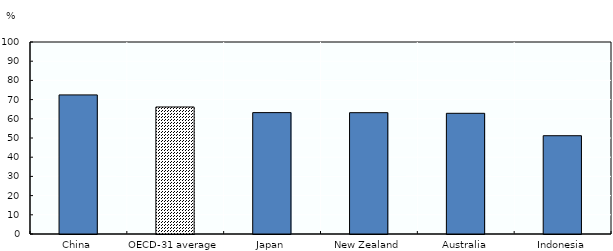
| Category | Series 1 |
|---|---|
| China | 72.44 |
| OECD-31 average | 66.162 |
| Japan | 63.22 |
| New Zealand | 63.191 |
| Australia | 62.864 |
| Indonesia | 51.19 |